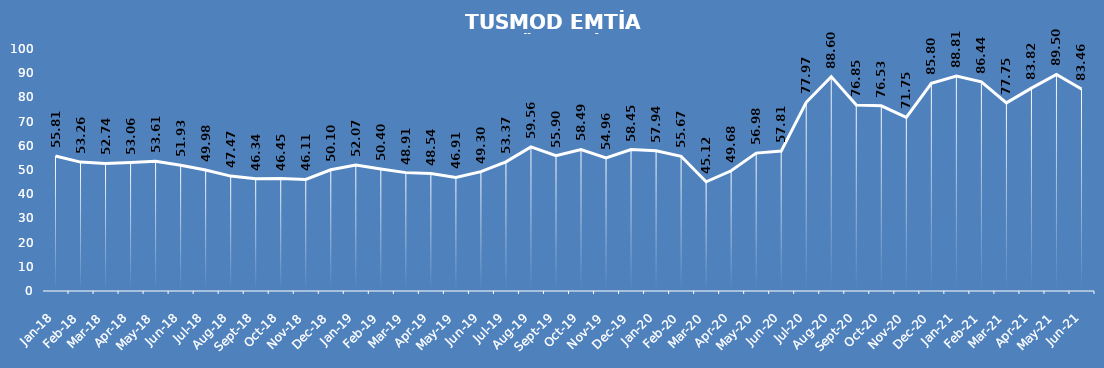
| Category | Series 0 |
|---|---|
| 2018-01-31 | 55.815 |
| 2018-02-28 | 53.256 |
| 2018-03-31 | 52.737 |
| 2018-04-30 | 53.061 |
| 2018-05-31 | 53.612 |
| 2018-06-30 | 51.927 |
| 2018-07-31 | 49.984 |
| 2018-08-31 | 47.473 |
| 2018-09-30 | 46.339 |
| 2018-10-31 | 46.453 |
| 2018-11-30 | 46.113 |
| 2018-12-31 | 50.097 |
| 2019-01-31 | 52.073 |
| 2019-02-28 | 50.405 |
| 2019-03-31 | 48.915 |
| 2019-04-30 | 48.542 |
| 2019-05-31 | 46.906 |
| 2019-06-30 | 49.304 |
| 2019-07-31 | 53.369 |
| 2019-08-31 | 59.556 |
| 2019-09-30 | 55.896 |
| 2019-10-31 | 58.487 |
| 2019-11-30 | 54.956 |
| 2019-12-31 | 58.455 |
| 2020-01-31 | 57.937 |
| 2020-02-29 | 55.669 |
| 2020-03-31 | 45.125 |
| 2020-04-30 | 49.676 |
| 2020-05-31 | 56.981 |
| 2020-06-30 | 57.807 |
| 2020-07-31 | 77.972 |
| 2020-08-31 | 88.597 |
| 2020-09-30 | 76.855 |
| 2020-10-31 | 76.531 |
| 2020-11-30 | 71.753 |
| 2020-12-31 | 85.795 |
| 2021-01-31 | 88.808 |
| 2021-02-28 | 86.443 |
| 2021-03-31 | 77.745 |
| 2021-04-30 | 83.819 |
| 2021-05-31 | 89.504 |
| 2021-06-30 | 83.463 |